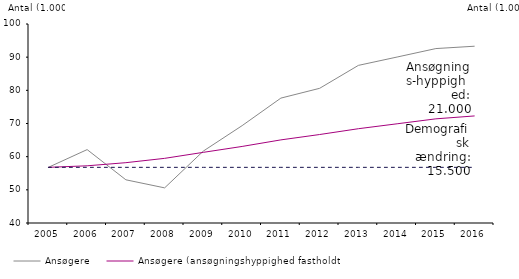
| Category | Ansøgere | Ansøgere (ansøgningshyppighed fastholdt) | Ansøgere 2005 |
|---|---|---|---|
| 2005.0 | 56785 | 56785 |  |
| 2006.0 | 62132 | 57244 |  |
| 2007.0 | 53025 | 58187 |  |
| 2008.0 | 50592 | 59492 |  |
| 2009.0 | 61699 | 61306 |  |
| 2010.0 | 69358 | 63082 |  |
| 2011.0 | 77657 | 65061 |  |
| 2012.0 | 80608 | 66674 |  |
| 2013.0 | 87522 | 68431 |  |
| 2014.0 | 90043 | 69915 |  |
| 2015.0 | 92590 | 71404 |  |
| 2016.0 | 93305 | 72284 |  |